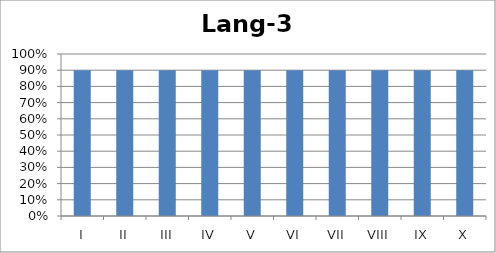
| Category | Lang-3 |
|---|---|
| I | 0.9 |
| II | 0.9 |
| III | 0.9 |
| IV | 0.9 |
| V | 0.9 |
| VI | 0.9 |
| VII | 0.9 |
| VIII | 0.9 |
| IX | 0.9 |
| X | 0.9 |